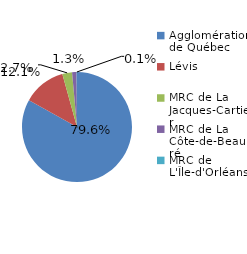
| Category | Series 0 |
|---|---|
| Agglomération de Québec | 0.796 |
| Lévis | 0.121 |
| MRC de La Jacques-Cartier | 0.027 |
| MRC de La Côte-de-Beaupré | 0.013 |
| MRC de L'Île-d'Orléans | 0.001 |